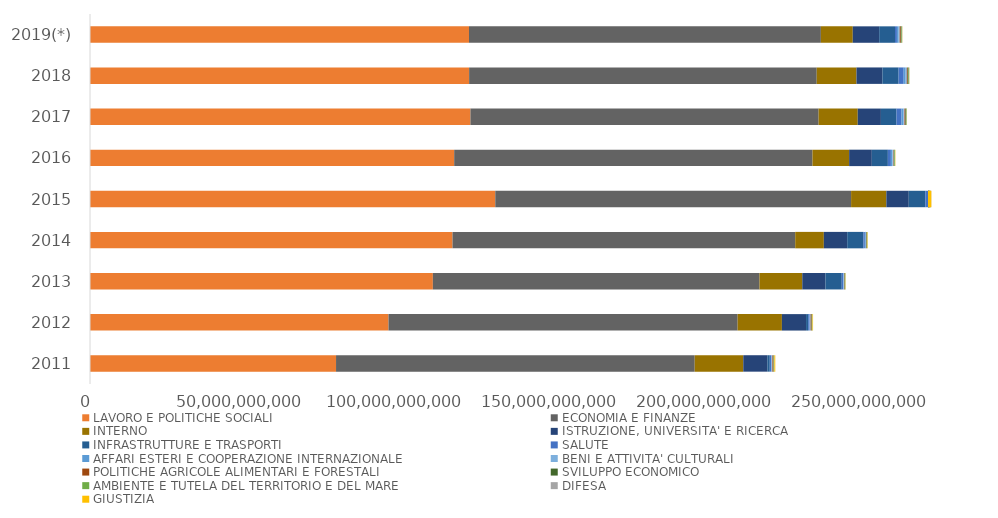
| Category | LAVORO E POLITICHE SOCIALI | ECONOMIA E FINANZE | INTERNO | ISTRUZIONE, UNIVERSITA' E RICERCA | INFRASTRUTTURE E TRASPORTI | SALUTE | AFFARI ESTERI E COOPERAZIONE INTERNAZIONALE | BENI E ATTIVITA' CULTURALI | POLITICHE AGRICOLE ALIMENTARI E FORESTALI | SVILUPPO ECONOMICO | AMBIENTE E TUTELA DEL TERRITORIO E DEL MARE | DIFESA | GIUSTIZIA |
|---|---|---|---|---|---|---|---|---|---|---|---|---|---|
| 2011 | 79274775216.03 | 115559914823.79 | 15647094596.11 | 7760412345.04 | 778164133.29 | 511717477.28 | 17173416.37 | 317780835.73 | 296695190 | 122938274.56 | 139650429.55 | 66843705.36 | 302091567 |
| 2012 | 96173665640.88 | 112490949506.98 | 14262855294.94 | 7782524470.71 | 678263984.96 | 482803818.18 | 16223182.19 | 304758652.37 | 294637932.49 | 119718713 | 138384639.96 | 47425855.8 | 171720129 |
| 2013 | 110470859415.06 | 105230520999.53 | 13792864862.67 | 7471936501.37 | 5244621892.83 | 461089931.08 | 17700481 | 297325390 | 147066578.3 | 96159365.41 | 141090301.23 | 44616495.75 | 77400115 |
| 2014 | 116802820292.76 | 110413431325.88 | 9222896206.17 | 7527260609.14 | 5248010301.87 | 451297526.32 | 17265022.09 | 340962859.24 | 152720365.26 | 127429341.82 | 154977165.65 | 41745598.63 | 111218594 |
| 2015 | 130576639097.13 | 114641971017.41 | 11359332404.29 | 7221801340.82 | 5329104198.07 | 934912690.99 | 18006171 | 333225051.21 | 145286918.23 | 287056145.33 | 170871852.62 | 61586757.6 | 132891992 |
| 2016 | 117337438449.83 | 115441933772.41 | 11811998849.28 | 7309419233.09 | 5168987953.02 | 975067531.35 | 470065832.21 | 349722117.67 | 134749236.64 | 175676162.49 | 184620380.62 | 47427865.56 | 88386138 |
| 2017 | 122575873650.91 | 112176677611.11 | 12611749383.35 | 7465828008.98 | 5023301344.22 | 1608498778.78 | 575554287.76 | 384394417.39 | 296339957.65 | 271842477.16 | 139130626.59 | 48748469.79 | 37504250.25 |
| 2018 | 122153449268.51 | 111996443568.71 | 12799789812.67 | 8346267834.79 | 5228936423.67 | 1648054029.91 | 618098607.79 | 388259054.3 | 302465360.55 | 248434570.29 | 154031881.29 | 101495469.71 | 55216406.2 |
| 2019(*) | 122111625511 | 113373584007 | 10275020822 | 8508633067 | 5090787221 | 628266251 | 539313091 | 352977044 | 349921487 | 216351285 | 162446014 | 100332407 | 53148112 |